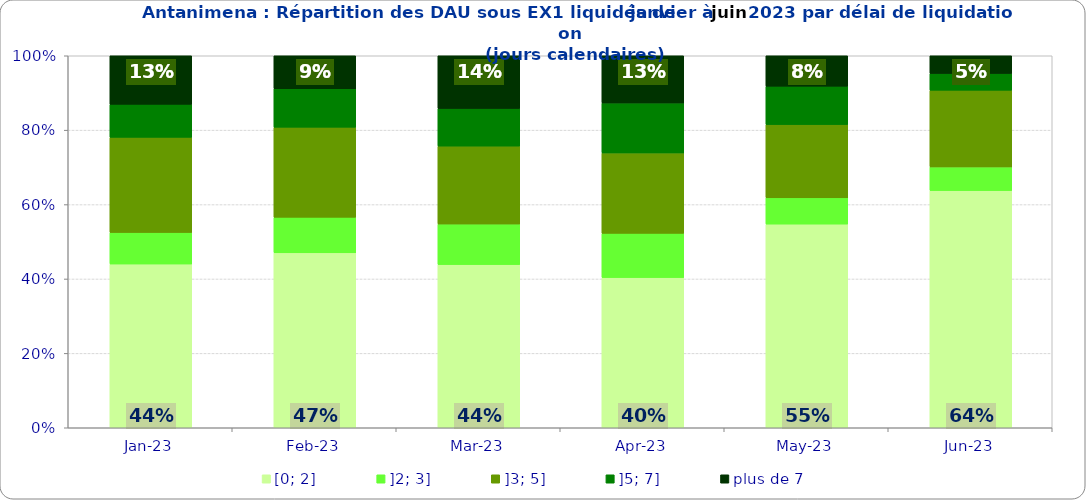
| Category | [0; 2] | ]2; 3] | ]3; 5] | ]5; 7] | plus de 7 |
|---|---|---|---|---|---|
| 2023-01-01 | 0.44 | 0.085 | 0.256 | 0.089 | 0.131 |
| 2023-02-01 | 0.47 | 0.096 | 0.242 | 0.103 | 0.089 |
| 2023-03-01 | 0.439 | 0.109 | 0.209 | 0.101 | 0.142 |
| 2023-04-01 | 0.404 | 0.119 | 0.216 | 0.134 | 0.127 |
| 2023-05-01 | 0.547 | 0.071 | 0.197 | 0.103 | 0.082 |
| 2023-06-01 | 0.638 | 0.064 | 0.206 | 0.045 | 0.047 |